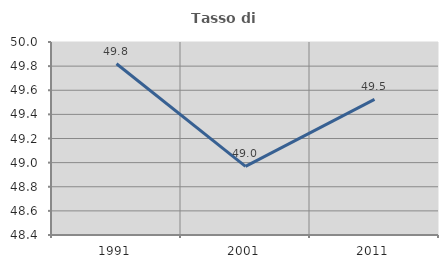
| Category | Tasso di occupazione   |
|---|---|
| 1991.0 | 49.82 |
| 2001.0 | 48.969 |
| 2011.0 | 49.525 |